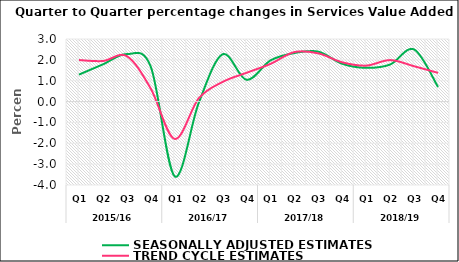
| Category | SEASONALLY ADJUSTED ESTIMATES | TREND CYCLE ESTIMATES |
|---|---|---|
| 0 | 1.292 | 1.991 |
| 1 | 1.783 | 1.945 |
| 2 | 2.275 | 2.177 |
| 3 | 1.671 | 0.62 |
| 4 | -3.585 | -1.79 |
| 5 | -0.073 | 0.153 |
| 6 | 2.267 | 0.942 |
| 7 | 1.042 | 1.38 |
| 8 | 1.973 | 1.807 |
| 9 | 2.328 | 2.374 |
| 10 | 2.393 | 2.311 |
| 11 | 1.811 | 1.881 |
| 12 | 1.616 | 1.724 |
| 13 | 1.777 | 1.989 |
| 14 | 2.5 | 1.694 |
| 15 | 0.7 | 1.376 |